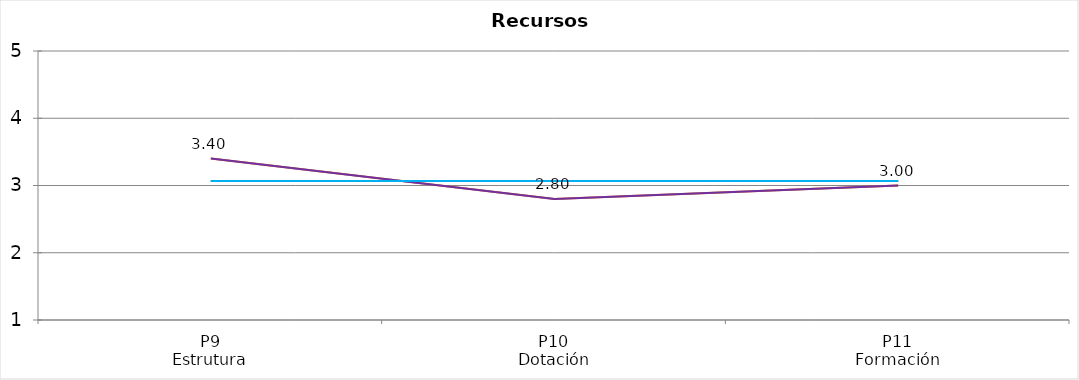
| Category | Valoración (1-5) | MEDIA |
|---|---|---|
| P9
Estrutura | 3.4 | 3.067 |
| P10
Dotación | 2.8 | 3.067 |
| P11
Formación | 3 | 3.067 |